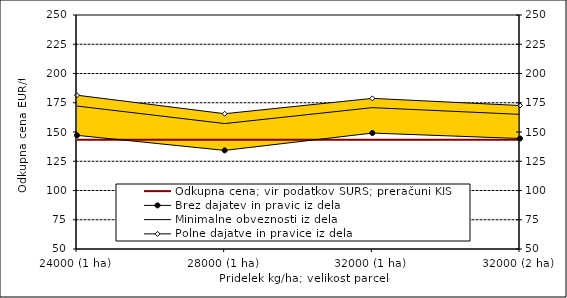
| Category | Odkupna cena; vir podatkov SURS; preračuni KIS |
|---|---|
| 24000 (1 ha) | 143.42 |
| 28000 (1 ha) | 143.42 |
| 32000 (1 ha) | 143.42 |
| 32000 (2 ha) | 143.42 |